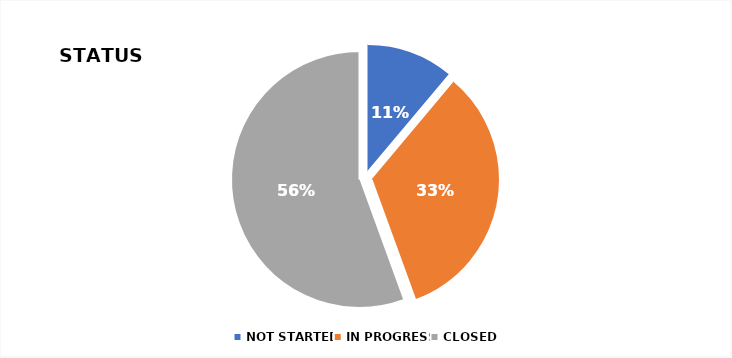
| Category | Series 0 |
|---|---|
| NOT STARTED | 1 |
| IN PROGRESS | 3 |
| CLOSED | 5 |